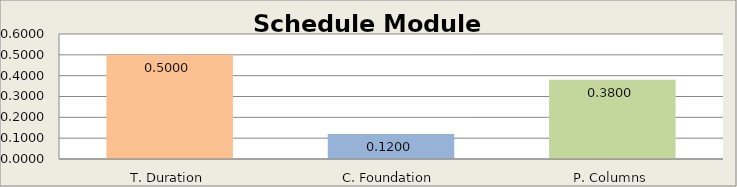
| Category | Schedule Module |
|---|---|
| T. Duration | 0.5 |
| C. Foundation | 0.12 |
| P. Columns | 0.38 |